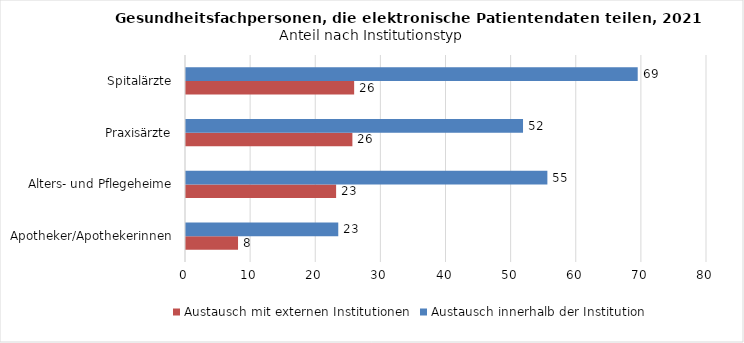
| Category | Austausch mit externen Institutionen | Austausch innerhalb der Institution |
|---|---|---|
| Apotheker/Apothekerinnen | 7.99 | 23.38 |
| Alters- und Pflegeheime | 23.05 | 55.49 |
| Praxisärzte | 25.55 | 51.75 |
| Spitalärzte | 25.82 | 69.36 |